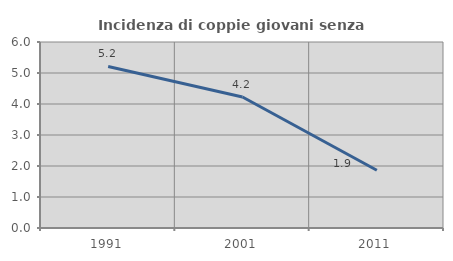
| Category | Incidenza di coppie giovani senza figli |
|---|---|
| 1991.0 | 5.211 |
| 2001.0 | 4.225 |
| 2011.0 | 1.863 |